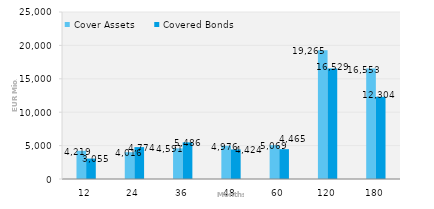
| Category | Cover Assets | Covered Bonds |
|---|---|---|
| 12.0 | 4218.502 | 3055 |
| 24.0 | 4016.036 | 4774.233 |
| 36.0 | 4590.542 | 5486.337 |
| 48.0 | 4976.254 | 4423.954 |
| 60.0 | 5069.276 | 4465 |
| 120.0 | 19264.754 | 16528.581 |
| 180.0 | 16552.577 | 12304.373 |